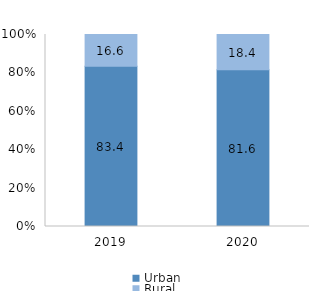
| Category | Urban | Rural |
|---|---|---|
| 2019.0 | 83.4 | 16.6 |
| 2020.0 | 81.6 | 18.4 |